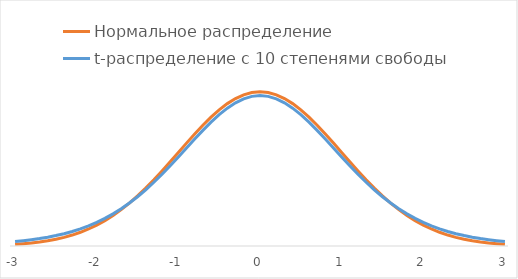
| Category | Нормальное распределение | t-распределение с 10 степенями свободы |
|---|---|---|
| -3.0 | 0.004 | 0.011 |
| -2.9 | 0.006 | 0.014 |
| -2.8 | 0.008 | 0.016 |
| -2.6999999999999997 | 0.01 | 0.019 |
| -2.5999999999999996 | 0.014 | 0.023 |
| -2.4999999999999996 | 0.018 | 0.027 |
| -2.3999999999999995 | 0.022 | 0.032 |
| -2.2999999999999994 | 0.028 | 0.038 |
| -2.1999999999999993 | 0.035 | 0.044 |
| -2.099999999999999 | 0.044 | 0.052 |
| -1.9999999999999991 | 0.054 | 0.061 |
| -1.899999999999999 | 0.066 | 0.071 |
| -1.799999999999999 | 0.079 | 0.083 |
| -1.6999999999999988 | 0.094 | 0.096 |
| -1.5999999999999988 | 0.111 | 0.111 |
| -1.4999999999999987 | 0.13 | 0.127 |
| -1.3999999999999986 | 0.15 | 0.145 |
| -1.2999999999999985 | 0.171 | 0.165 |
| -1.1999999999999984 | 0.194 | 0.186 |
| -1.0999999999999983 | 0.218 | 0.208 |
| -0.9999999999999983 | 0.242 | 0.23 |
| -0.8999999999999984 | 0.266 | 0.254 |
| -0.7999999999999984 | 0.29 | 0.277 |
| -0.6999999999999984 | 0.312 | 0.299 |
| -0.5999999999999984 | 0.333 | 0.32 |
| -0.49999999999999845 | 0.352 | 0.34 |
| -0.39999999999999847 | 0.368 | 0.357 |
| -0.2999999999999985 | 0.381 | 0.37 |
| -0.19999999999999848 | 0.391 | 0.381 |
| -0.09999999999999848 | 0.397 | 0.387 |
| 0.0 | 0.399 | 0.389 |
| 0.1 | 0.397 | 0.387 |
| 0.2 | 0.391 | 0.381 |
| 0.30000000000000004 | 0.381 | 0.37 |
| 0.4 | 0.368 | 0.357 |
| 0.5 | 0.352 | 0.34 |
| 0.6 | 0.333 | 0.32 |
| 0.7 | 0.312 | 0.299 |
| 0.7999999999999999 | 0.29 | 0.277 |
| 0.8999999999999999 | 0.266 | 0.254 |
| 0.9999999999999999 | 0.242 | 0.23 |
| 1.0999999999999999 | 0.218 | 0.208 |
| 1.2 | 0.194 | 0.186 |
| 1.3 | 0.171 | 0.165 |
| 1.4000000000000001 | 0.15 | 0.145 |
| 1.5000000000000002 | 0.13 | 0.127 |
| 1.6000000000000003 | 0.111 | 0.111 |
| 1.7000000000000004 | 0.094 | 0.096 |
| 1.8000000000000005 | 0.079 | 0.083 |
| 1.9000000000000006 | 0.066 | 0.071 |
| 2.0000000000000004 | 0.054 | 0.061 |
| 2.1000000000000005 | 0.044 | 0.052 |
| 2.2000000000000006 | 0.035 | 0.044 |
| 2.3000000000000007 | 0.028 | 0.038 |
| 2.400000000000001 | 0.022 | 0.032 |
| 2.500000000000001 | 0.018 | 0.027 |
| 2.600000000000001 | 0.014 | 0.023 |
| 2.700000000000001 | 0.01 | 0.019 |
| 2.800000000000001 | 0.008 | 0.016 |
| 2.9000000000000012 | 0.006 | 0.014 |
| 3.0000000000000013 | 0.004 | 0.011 |